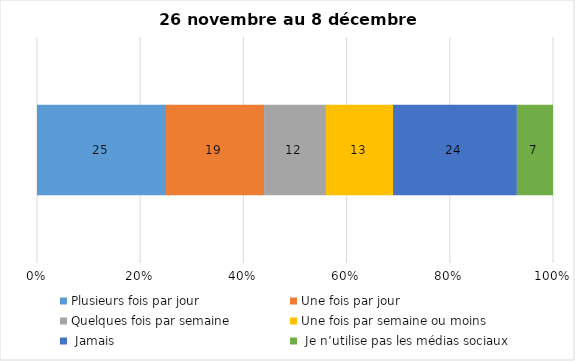
| Category | Plusieurs fois par jour | Une fois par jour | Quelques fois par semaine   | Une fois par semaine ou moins   |  Jamais   |  Je n’utilise pas les médias sociaux |
|---|---|---|---|---|---|---|
| 0 | 25 | 19 | 12 | 13 | 24 | 7 |